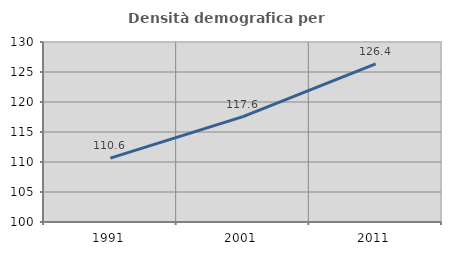
| Category | Densità demografica |
|---|---|
| 1991.0 | 110.639 |
| 2001.0 | 117.573 |
| 2011.0 | 126.356 |